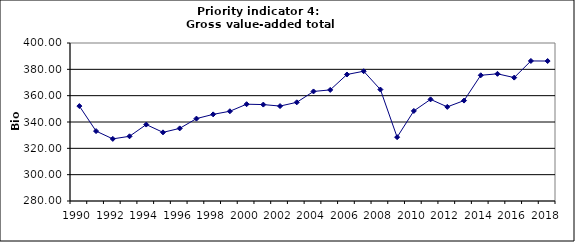
| Category | Gross value-added total industry, Bio Euro (EC95) |
|---|---|
| 1990 | 352.081 |
| 1991 | 333.089 |
| 1992 | 327.174 |
| 1993 | 329.142 |
| 1994 | 338.046 |
| 1995 | 332.137 |
| 1996 | 335.155 |
| 1997 | 342.567 |
| 1998 | 345.794 |
| 1999 | 348.175 |
| 2000 | 353.518 |
| 2001 | 353.229 |
| 2002 | 352.102 |
| 2003 | 354.951 |
| 2004 | 363.206 |
| 2005 | 364.379 |
| 2006 | 376.079 |
| 2007 | 378.565 |
| 2008 | 364.643 |
| 2009 | 328.483 |
| 2010 | 348.416 |
| 2011 | 357.189 |
| 2012 | 351.481 |
| 2013 | 356.26 |
| 2014 | 375.488 |
| 2015 | 376.589 |
| 2016 | 373.721 |
| 2017 | 386.373 |
| 2018 | 386.297 |